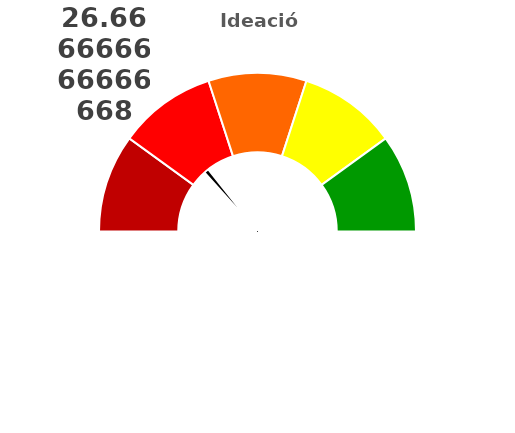
| Category | refe |
|---|---|
| 0 | 26.667 |
| 1 | 2 |
| 2 | 171.333 |